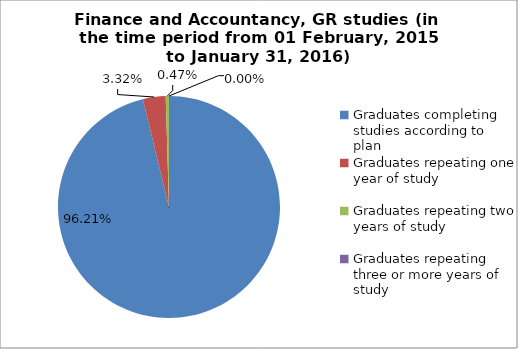
| Category | Series 0 |
|---|---|
| Graduates completing studies according to plan | 96.209 |
| Graduates repeating one year of study | 3.318 |
| Graduates repeating two years of study | 0.474 |
| Graduates repeating three or more years of study | 0 |